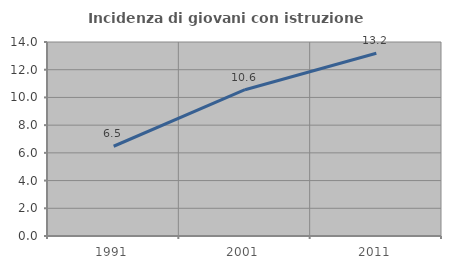
| Category | Incidenza di giovani con istruzione universitaria |
|---|---|
| 1991.0 | 6.477 |
| 2001.0 | 10.555 |
| 2011.0 | 13.183 |